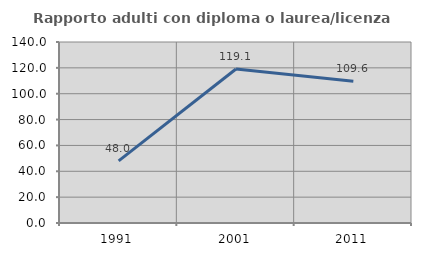
| Category | Rapporto adulti con diploma o laurea/licenza media  |
|---|---|
| 1991.0 | 48 |
| 2001.0 | 119.149 |
| 2011.0 | 109.615 |